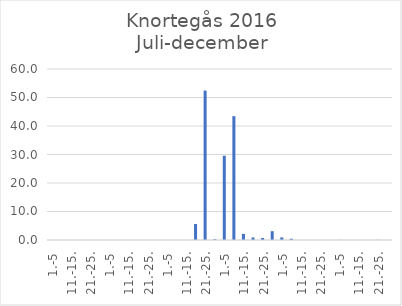
| Category | Series 0 |
|---|---|
| 1.-5 | 0 |
| 6.-10. | 0 |
| 11.-15. | 0 |
| 16.-20. | 0 |
| 21.-25. | 0 |
| 26.-31. | 0 |
| 1.-5 | 0 |
| 6.-10. | 0 |
| 11.-15. | 0 |
| 16.-20. | 0 |
| 21.-25. | 0 |
| 26.-31. | 0 |
| 1.-5 | 0 |
| 6.-10. | 0 |
| 11.-15. | 0 |
| 16.-20. | 5.602 |
| 21.-25. | 52.423 |
| 26.-30. | 0.258 |
| 1.-5 | 29.571 |
| 6.-10. | 43.442 |
| 11.-15. | 2.141 |
| 16.-20. | 0.895 |
| 21.-25. | 0.708 |
| 26.-31. | 3.093 |
| 1.-5 | 0.914 |
| 6.-10. | 0.447 |
| 11.-15. | 0 |
| 16.-20. | 0 |
| 21.-25. | 0 |
| 26.-30. | 0 |
| 1.-5 | 0.04 |
| 6.-10. | 0 |
| 11.-15. | 0 |
| 16.-20. | 0 |
| 21.-25. | 0.055 |
| 26.-31. | 0 |